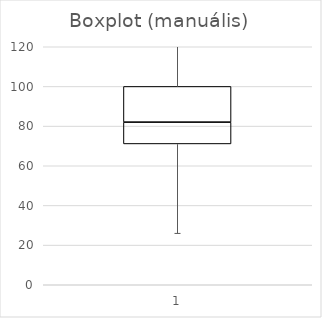
| Category | Series 0 | Series 1 | Series 2 |
|---|---|---|---|
| 0 | 71 | 11 | 18 |